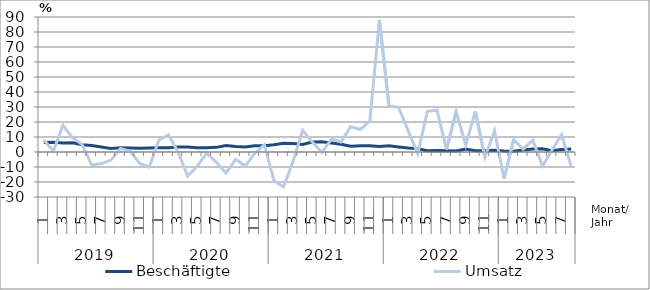
| Category | Beschäftigte | Umsatz |
|---|---|---|
| 0 | 6.4 | 8.2 |
| 1 | 6.5 | 0.6 |
| 2 | 6 | 17.8 |
| 3 | 6.1 | 9.6 |
| 4 | 4.9 | 4.9 |
| 5 | 4.3 | -8.8 |
| 6 | 3.3 | -7.7 |
| 7 | 2.4 | -5.4 |
| 8 | 2.8 | 2.4 |
| 9 | 2.7 | 0.5 |
| 10 | 2.5 | -7.6 |
| 11 | 2.7 | -10 |
| 12 | 2.9 | 7.8 |
| 13 | 2.9 | 11.5 |
| 14 | 3.4 | 0.1 |
| 15 | 3.4 | -16.1 |
| 16 | 2.9 | -9.5 |
| 17 | 2.9 | -0.8 |
| 18 | 3.1 | -6.9 |
| 19 | 4.3 | -14 |
| 20 | 3.6 | -4.9 |
| 21 | 3.4 | -9.4 |
| 22 | 4.1 | -0.9 |
| 23 | 4.1 | 4.9 |
| 24 | 4.8 | -19.1 |
| 25 | 5.8 | -23.3 |
| 26 | 5.6 | -6.1 |
| 27 | 5 | 14.4 |
| 28 | 6.6 | 6.6 |
| 29 | 6.9 | -0.3 |
| 30 | 6 | 8.7 |
| 31 | 5.2 | 6.7 |
| 32 | 3.8 | 16.9 |
| 33 | 4.2 | 15 |
| 34 | 4.2 | 20.6 |
| 35 | 3.7 | 88.1 |
| 36 | 4.1 | 30.7 |
| 37 | 3.4 | 29.8 |
| 38 | 2.6 | 14.1 |
| 39 | 2.1 | -1.1 |
| 40 | 0.9 | 27.1 |
| 41 | 1 | 27.9 |
| 42 | 0.8 | 1.7 |
| 43 | 0.7 | 27 |
| 44 | 2 | 4.7 |
| 45 | 0.9 | 27.1 |
| 46 | 0.9 | -3.5 |
| 47 | 1.2 | 14.1 |
| 48 | 0.6 | -17.8 |
| 49 | 0.5 | 8.2 |
| 50 | 1.4 | 1.9 |
| 51 | 2 | 7.9 |
| 52 | 2.2 | -9.4 |
| 53 | 0.9 | 1.3 |
| 54 | 1.6 | 11.5 |
| 55 | 2 | -9.6 |